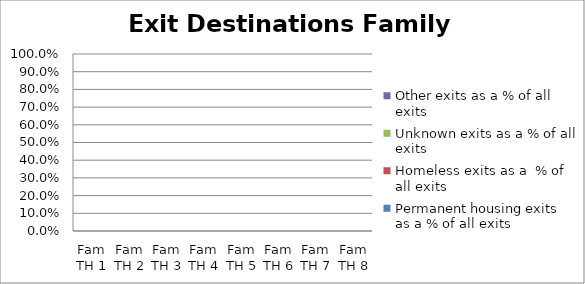
| Category | Permanent housing exits as a % of all exits | Homeless exits as a  % of all exits | Unknown exits as a % of all exits | Other exits as a % of all exits |
|---|---|---|---|---|
| Fam TH 1 | 0 | 0 | 0 | 0 |
| Fam TH 2 | 0 | 0 | 0 | 0 |
| Fam TH 3 | 0 | 0 | 0 | 0 |
| Fam TH 4 | 0 | 0 | 0 | 0 |
| Fam TH 5 | 0 | 0 | 0 | 0 |
| Fam TH 6 | 0 | 0 | 0 | 0 |
| Fam TH 7 | 0 | 0 | 0 | 0 |
| Fam TH 8 | 0 | 0 | 0 | 0 |